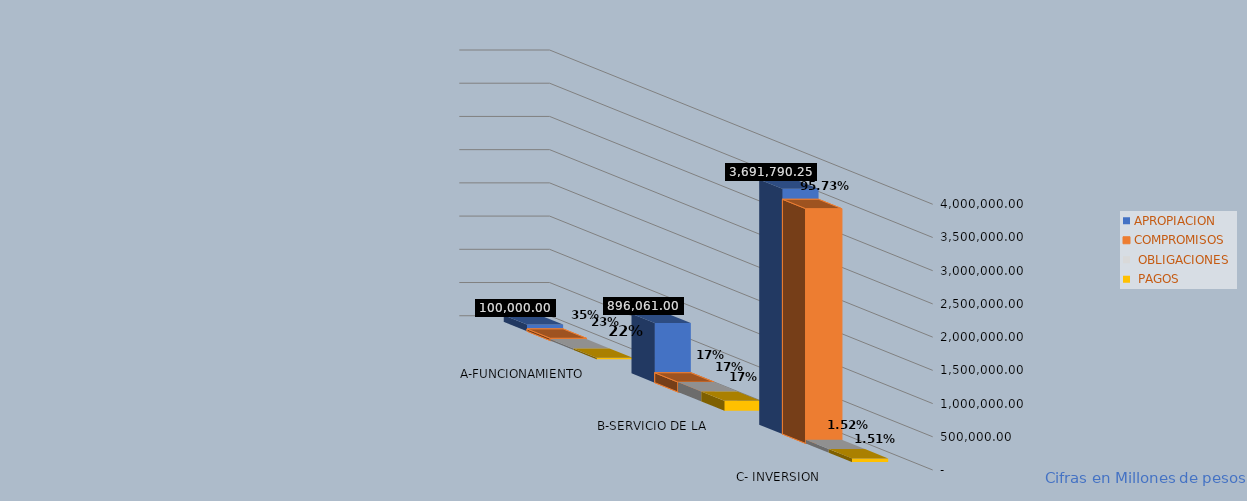
| Category | APROPIACION | COMPROMISOS |  OBLIGACIONES |  PAGOS |
|---|---|---|---|---|
| A-FUNCIONAMIENTO | 100000.001 | 35031.901 | 22684.626 | 21559.35 |
| B-SERVICIO DE LA DEUDA PÚBLICA | 896061 | 149015.292 | 149015.292 | 149015.292 |
| C- INVERSION | 3691790.247 | 3534129.875 | 56023.905 | 55797.668 |